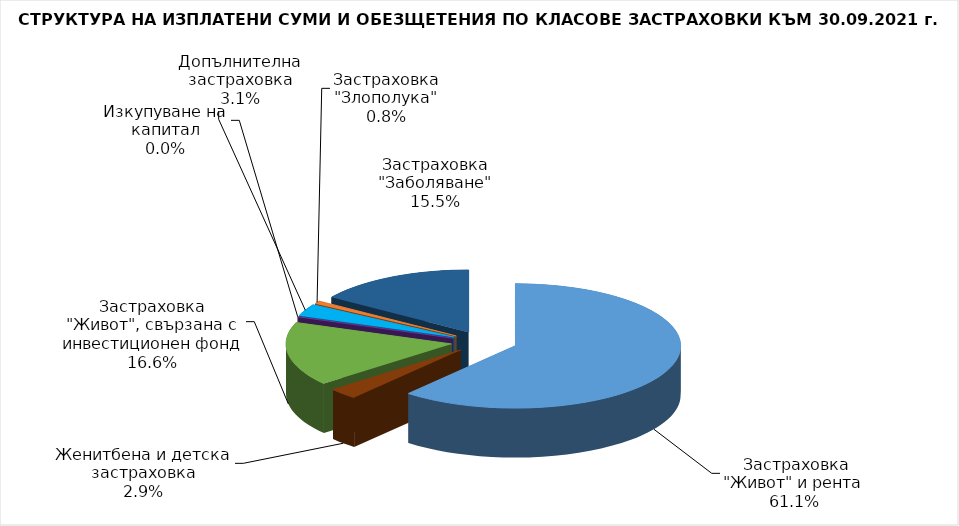
| Category |  Застраховка "Живот" и рента |
|---|---|
|  Застраховка "Живот" и рента | 100251885.986 |
| Женитбена и детска застраховка | 4729067.577 |
| Застраховка "Живот", свързана с инвестиционен фонд | 27225058.944 |
| Изкупуване на капитал | 0 |
| Допълнителна застраховка | 5108349.207 |
| Застраховка "Злополука" | 1235027.168 |
| Застраховка "Заболяване" | 25467816.473 |